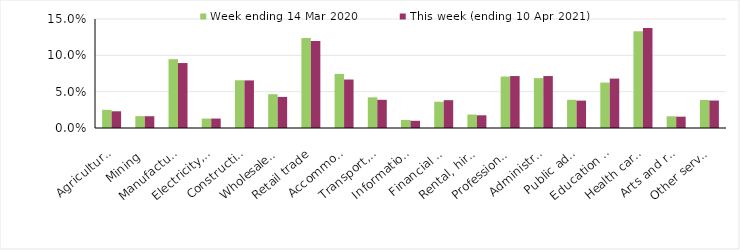
| Category | Week ending 14 Mar 2020 | This week (ending 10 Apr 2021) |
|---|---|---|
| Agriculture, forestry and fishing | 0.025 | 0.023 |
| Mining | 0.016 | 0.016 |
| Manufacturing | 0.095 | 0.089 |
| Electricity, gas, water and waste services | 0.013 | 0.013 |
| Construction | 0.066 | 0.066 |
| Wholesale trade | 0.046 | 0.043 |
| Retail trade | 0.124 | 0.12 |
| Accommodation and food services | 0.074 | 0.067 |
| Transport, postal and warehousing | 0.042 | 0.039 |
| Information media and telecommunications | 0.011 | 0.01 |
| Financial and insurance services | 0.036 | 0.038 |
| Rental, hiring and real estate services | 0.018 | 0.018 |
| Professional, scientific and technical services | 0.071 | 0.072 |
| Administrative and support services | 0.069 | 0.072 |
| Public administration and safety | 0.039 | 0.038 |
| Education and training | 0.062 | 0.068 |
| Health care and social assistance | 0.133 | 0.138 |
| Arts and recreation services | 0.016 | 0.016 |
| Other services | 0.038 | 0.038 |